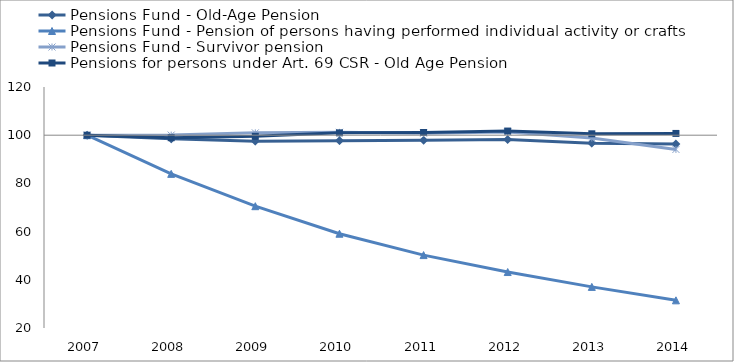
| Category | Pensions Fund - Old-Age Pension | Pensions Fund - Pension of persons having performed individual activity or crafts | Pensions Fund - Survivor pension | Anticipated Old-Age Pension for insurance period and hazardous work | Pensions for persons under Art. 69 CSR - Old Age Pension |
|---|---|---|---|---|---|
| 2007.0 | 100 | 100 | 100 |  | 100 |
| 2008.0 | 98.478 | 83.957 | 100.05 |  | 98.962 |
| 2009.0 | 97.53 | 70.538 | 100.97 |  | 99.527 |
| 2010.0 | 97.743 | 59.119 | 101.198 |  | 100.973 |
| 2011.0 | 97.923 | 50.245 | 100.817 |  | 101.133 |
| 2012.0 | 98.219 | 43.218 | 101.346 |  | 101.721 |
| 2013.0 | 96.702 | 37.058 | 98.819 |  | 100.583 |
| 2014.0 | 96.357 | 31.478 | 94.094 |  | 100.734 |